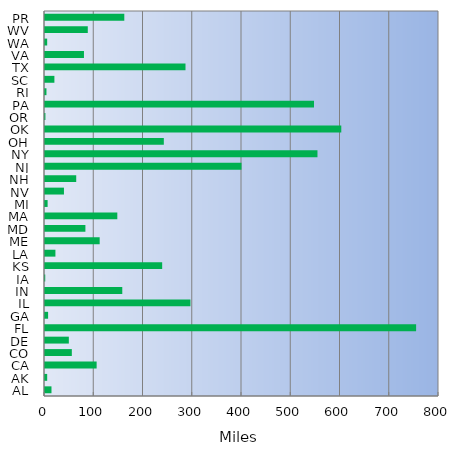
| Category | Series 0 |
|---|---|
| AL | 13.16 |
| AK | 4.444 |
| CA | 104.851 |
| CO | 54.468 |
| DE | 48.4 |
| FL | 753.532 |
| GA | 6.31 |
| IL | 295.29 |
| IN | 156.92 |
| IA | 0.489 |
| KS | 237.929 |
| LA | 21.16 |
| ME | 111.02 |
| MD | 82.047 |
| MA | 146.826 |
| MI | 5.309 |
| NV | 38.488 |
| NH | 63.401 |
| NJ | 398.98 |
| NY | 553.24 |
| OH | 241.26 |
| OK | 601.6 |
| OR | 0.84 |
| PA | 546.191 |
| RI | 2.97 |
| SC | 19.09 |
| TX | 285.285 |
| VA | 79.11 |
| WA | 4.43 |
| WV | 86.88 |
| PR | 161.031 |